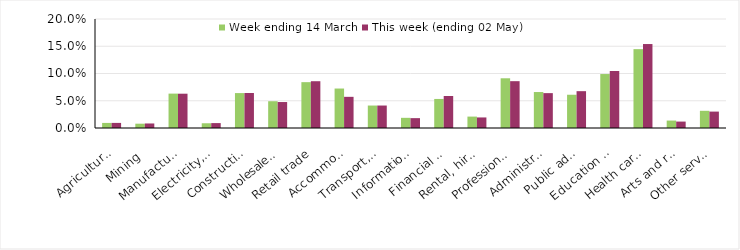
| Category | Week ending 14 March | This week (ending 02 May) |
|---|---|---|
| Agriculture, forestry and fishing | 0.009 | 0.009 |
| Mining | 0.008 | 0.008 |
| Manufacturing | 0.063 | 0.063 |
| Electricity, gas, water and waste services | 0.009 | 0.009 |
| Construction | 0.064 | 0.064 |
| Wholesale trade | 0.049 | 0.048 |
| Retail trade | 0.084 | 0.086 |
| Accommodation and food services | 0.072 | 0.057 |
| Transport, postal and warehousing | 0.041 | 0.041 |
| Information media and telecommunications | 0.019 | 0.018 |
| Financial and insurance services | 0.053 | 0.059 |
| Rental, hiring and real estate services | 0.021 | 0.019 |
| Professional, scientific and technical services | 0.091 | 0.086 |
| Administrative and support services | 0.066 | 0.064 |
| Public administration and safety | 0.061 | 0.068 |
| Education and training | 0.099 | 0.105 |
| Health care and social assistance | 0.145 | 0.154 |
| Arts and recreation services | 0.014 | 0.012 |
| Other services | 0.032 | 0.03 |